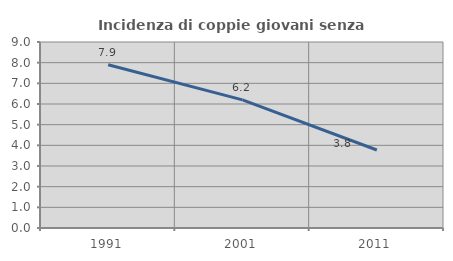
| Category | Incidenza di coppie giovani senza figli |
|---|---|
| 1991.0 | 7.899 |
| 2001.0 | 6.2 |
| 2011.0 | 3.773 |